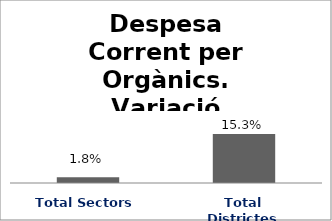
| Category | Series 0 |
|---|---|
| Total Sectors | 0.018 |
| Total Districtes | 0.153 |